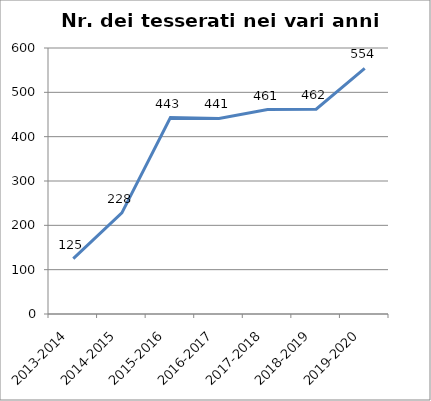
| Category | Nr. Tesserati |
|---|---|
| 2013-2014 | 125 |
| 2014-2015 | 228 |
| 2015-2016 | 443 |
| 2016-2017 | 441 |
| 2017-2018 | 461 |
| 2018-2019 | 462 |
| 2019-2020 | 554 |